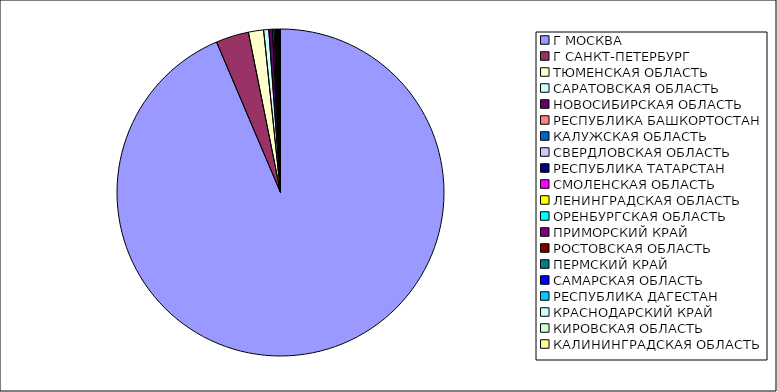
| Category | Оборот |
|---|---|
| Г МОСКВА | 0.935 |
| Г САНКТ-ПЕТЕРБУРГ | 0.032 |
| ТЮМЕНСКАЯ ОБЛАСТЬ | 0.015 |
| САРАТОВСКАЯ ОБЛАСТЬ | 0.005 |
| НОВОСИБИРСКАЯ ОБЛАСТЬ | 0.004 |
| РЕСПУБЛИКА БАШКОРТОСТАН | 0.001 |
| КАЛУЖСКАЯ ОБЛАСТЬ | 0.001 |
| СВЕРДЛОВСКАЯ ОБЛАСТЬ | 0.001 |
| РЕСПУБЛИКА ТАТАРСТАН | 0.001 |
| СМОЛЕНСКАЯ ОБЛАСТЬ | 0.001 |
| ЛЕНИНГРАДСКАЯ ОБЛАСТЬ | 0 |
| ОРЕНБУРГСКАЯ ОБЛАСТЬ | 0 |
| ПРИМОРСКИЙ КРАЙ | 0 |
| РОСТОВСКАЯ ОБЛАСТЬ | 0 |
| ПЕРМСКИЙ КРАЙ | 0 |
| САМАРСКАЯ ОБЛАСТЬ | 0 |
| РЕСПУБЛИКА ДАГЕСТАН | 0 |
| КРАСНОДАРСКИЙ КРАЙ | 0 |
| КИРОВСКАЯ ОБЛАСТЬ | 0 |
| КАЛИНИНГРАДСКАЯ ОБЛАСТЬ | 0 |